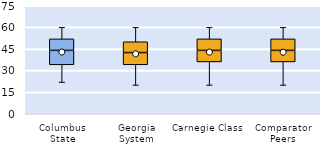
| Category | 25th | 50th | 75th |
|---|---|---|---|
| Columbus State | 34 | 10 | 8 |
| Georgia System | 34 | 8.5 | 7.5 |
| Carnegie Class | 36 | 8 | 8 |
| Comparator Peers | 36 | 8 | 8 |